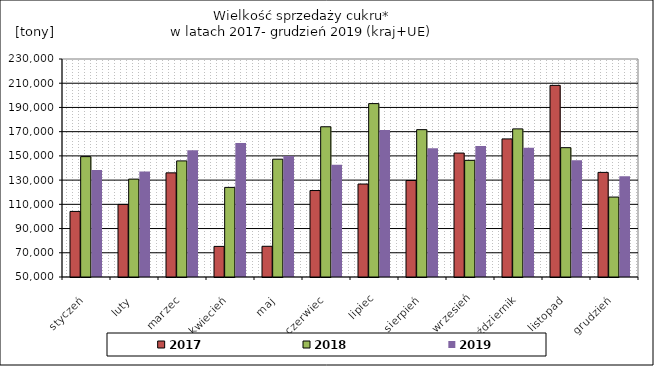
| Category | 2017 | 2018 | 2019 |
|---|---|---|---|
| styczeń | 104136.54 | 149394.09 | 138330.31 |
| luty | 109933.585 | 130822.53 | 137095.49 |
| marzec | 135982.929 | 145863.79 | 154647.44 |
| kwiecień | 75261.914 | 123979.52 | 160722.77 |
| maj | 75360.525 | 147269.63 | 149962.12 |
| czerwiec | 121392.865 | 174058.88 | 142617.98 |
| lipiec | 126753.937 | 193169.88 | 171364.62 |
| sierpień | 129695.276 | 171663.7 | 156211.56 |
| wrzesień | 152326.381 | 146323.5 | 158226.28 |
| październik | 164010.68 | 172295.67 | 156804.33 |
| listopad | 208222.94 | 156790.45 | 146432.58 |
| grudzień | 136362.93 | 115997.05 | 133122.03 |